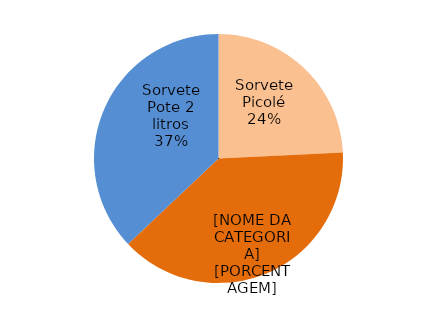
| Category | Series 0 |
|---|---|
| Sorvete Picolé | 10255 |
| Sorvete Massa | 16387 |
| Sorvete Pote 2 litros | 15690 |